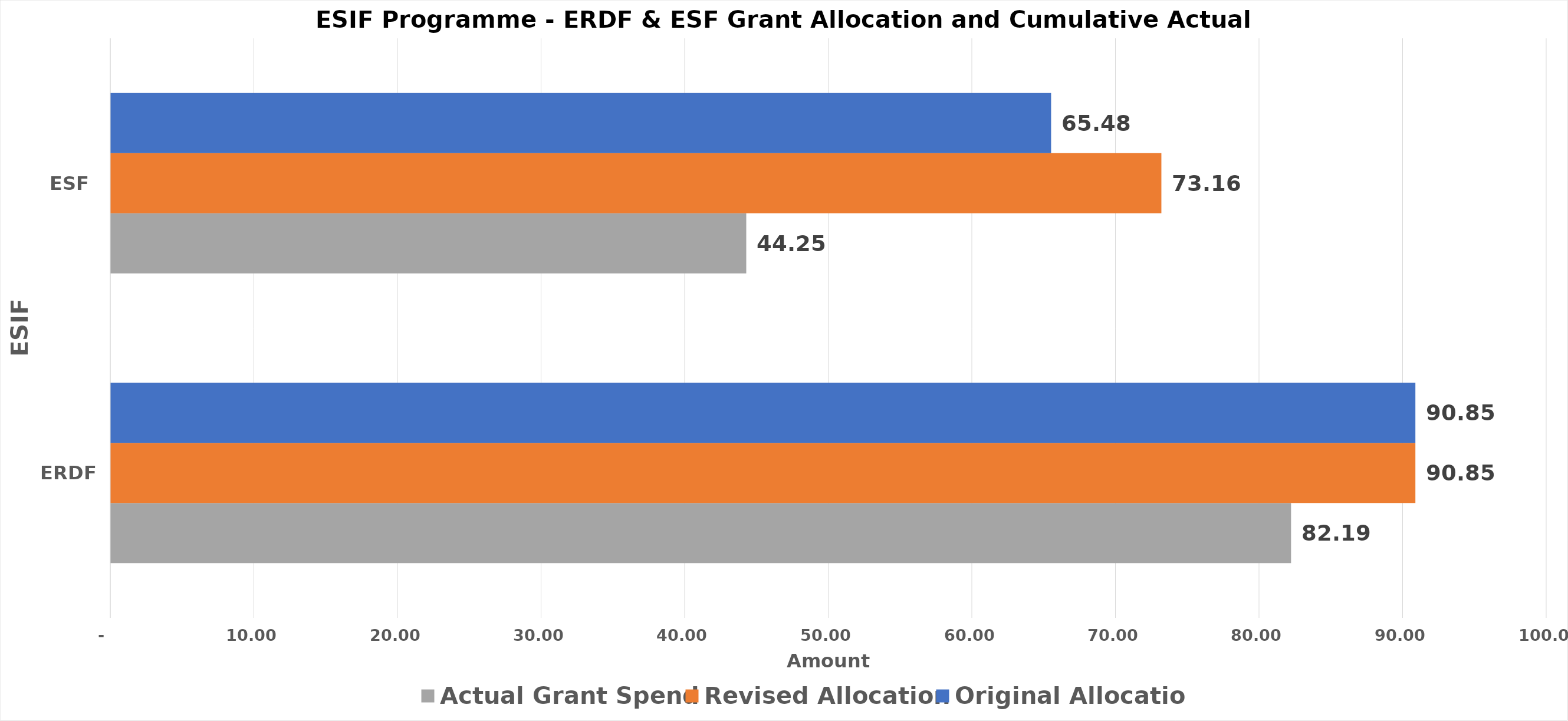
| Category | Actual Grant Spend | Revised Allocation | Original Allocation |
|---|---|---|---|
| ERDF | 82.19 | 90.85 | 90.85 |
| ESF | 44.25 | 73.16 | 65.48 |